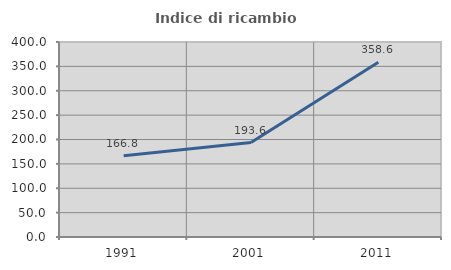
| Category | Indice di ricambio occupazionale  |
|---|---|
| 1991.0 | 166.845 |
| 2001.0 | 193.631 |
| 2011.0 | 358.586 |